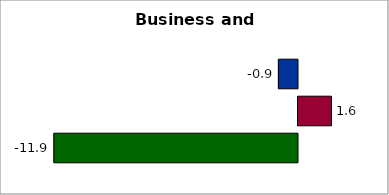
| Category | 50 states and D.C. | SREB states | State |
|---|---|---|---|
| 0 | -0.932 | 1.632 | -11.883 |